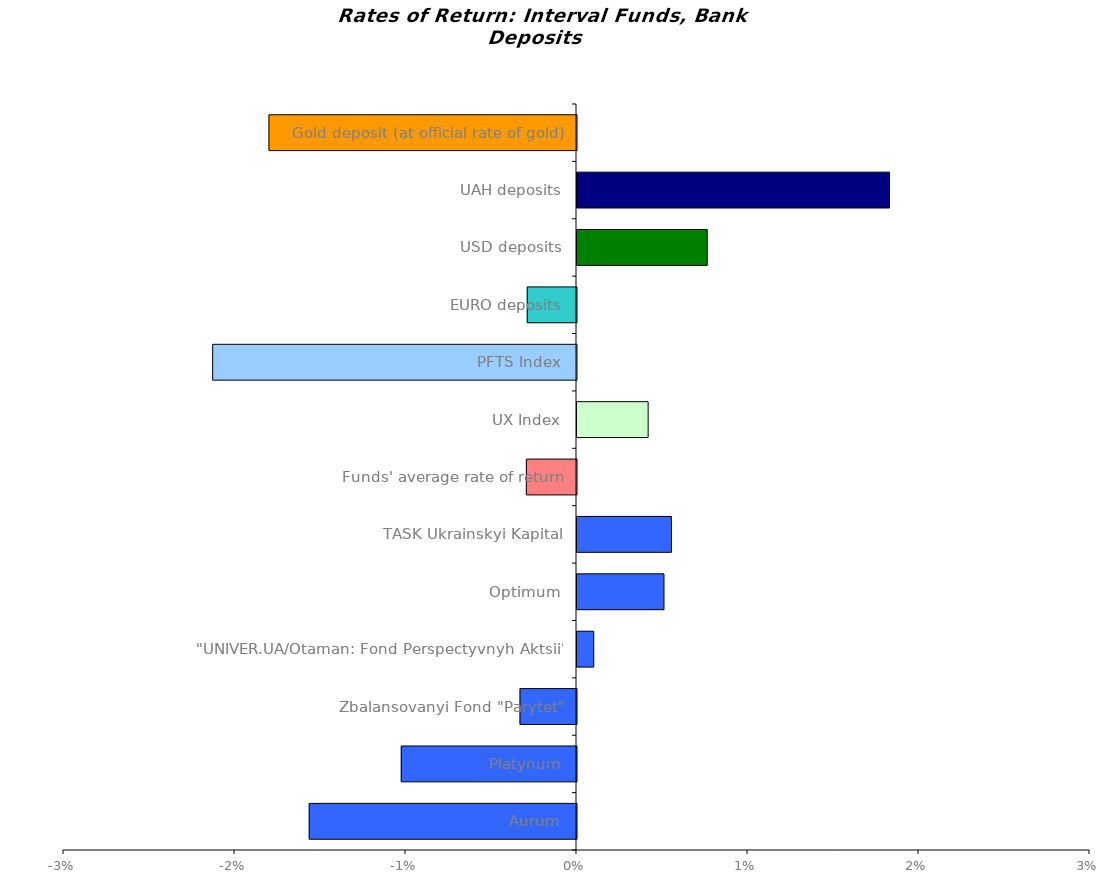
| Category | Series 0 |
|---|---|
| Aurum | -0.016 |
| Platynum | -0.01 |
| Zbalansovanyi Fond "Parytet" | -0.003 |
| "UNIVER.UA/Otaman: Fond Perspectyvnyh Aktsii" | 0.001 |
| Optimum | 0.005 |
| TASK Ukrainskyi Kapital | 0.006 |
| Funds' average rate of return | -0.003 |
| UX Index | 0.004 |
| PFTS Index | -0.021 |
| EURO deposits | -0.003 |
| USD deposits | 0.008 |
| UAH deposits | 0.018 |
| Gold deposit (at official rate of gold) | -0.018 |